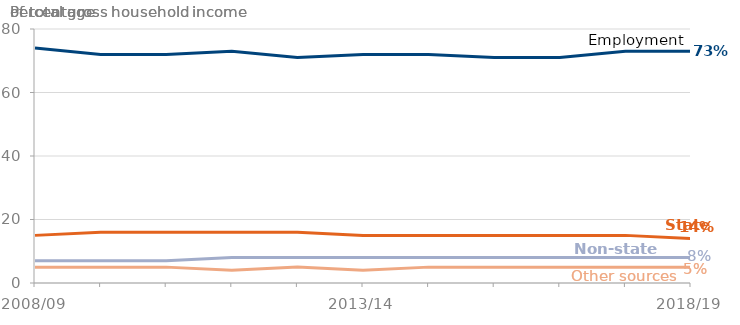
| Category | Employment | State support | Non-state pensions | Other sources |
|---|---|---|---|---|
| 2008/09 | 74 | 15 | 7 | 5 |
| 2009/10 | 72 | 16 | 7 | 5 |
| 2010/11 | 72 | 16 | 7 | 5 |
| 2011/12 | 73 | 16 | 8 | 4 |
| 2012/13 | 71 | 16 | 8 | 5 |
| 2013/14 | 72 | 15 | 8 | 4 |
| 2014/15 | 72 | 15 | 8 | 5 |
| 2015/16 | 71 | 15 | 8 | 5 |
| 2016/17 | 71 | 15 | 8 | 5 |
| 2017/18 | 73 | 15 | 8 | 5 |
| 2018/19 | 73 | 14 | 8 | 5 |